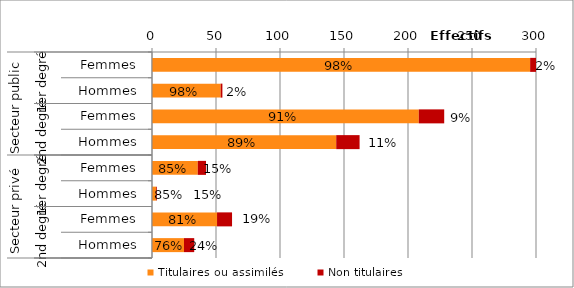
| Category | Titulaires ou assimilés | Non titulaires |
|---|---|---|
| 0 | 295422 | 5750 |
| 1 | 53667 | 1329 |
| 2 | 208443 | 19843 |
| 3 | 143924 | 18255 |
| 4 | 35762 | 6439 |
| 5 | 3264 | 583 |
| 6 | 50810 | 11728 |
| 7 | 24987 | 8000 |